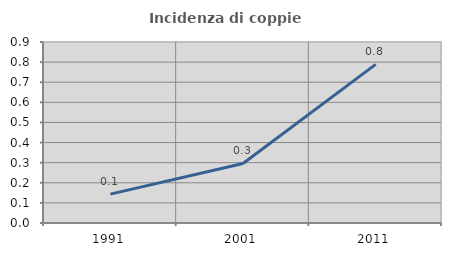
| Category | Incidenza di coppie miste |
|---|---|
| 1991.0 | 0.143 |
| 2001.0 | 0.296 |
| 2011.0 | 0.789 |